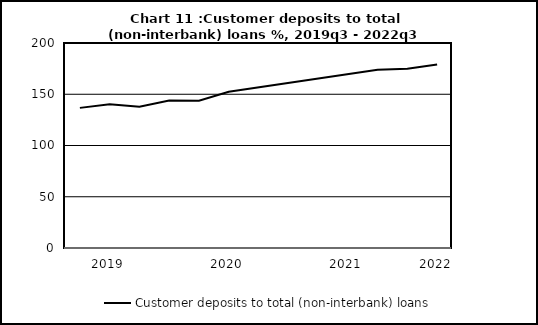
| Category | Customer deposits to total (non-interbank) loans |
|---|---|
| nan | 136.7 |
| 2019.0 | 140.3 |
| nan | 137.9 |
| nan | 143.8 |
| nan | 143.6 |
| 2020.0 | 152.4 |
| nan | 0 |
| nan | 0 |
| nan | 0 |
| 2021.0 | 0 |
| nan | 173.9 |
| nan | 174.9 |
| 2022.0 | 179.1 |